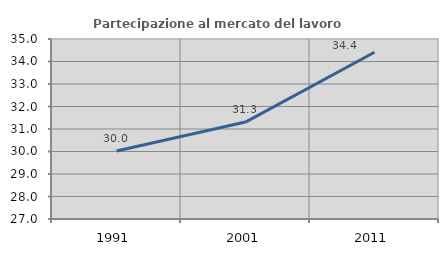
| Category | Partecipazione al mercato del lavoro  femminile |
|---|---|
| 1991.0 | 30.023 |
| 2001.0 | 31.308 |
| 2011.0 | 34.411 |